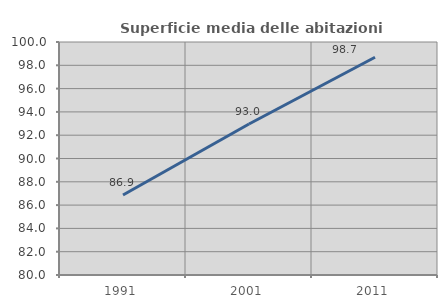
| Category | Superficie media delle abitazioni occupate |
|---|---|
| 1991.0 | 86.866 |
| 2001.0 | 92.963 |
| 2011.0 | 98.688 |